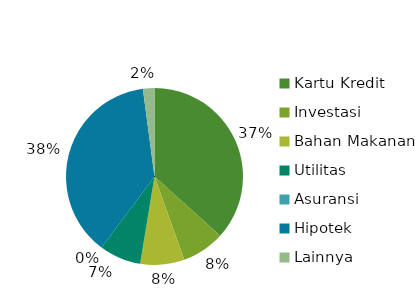
| Category | Total |
|---|---|
| Kartu Kredit | 936.48 |
| Investasi | 200 |
| Bahan Makanan | 205.61 |
| Utilitas | 194.2 |
| Asuransi | 0 |
| Hipotek | 961.77 |
| Lainnya | 53.65 |